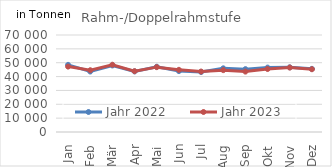
| Category | Jahr 2022 | Jahr 2023 |
|---|---|---|
| 0 | 48441.477 | 47197.034 |
| 1 | 43646.413 | 44569.553 |
| 2 | 48034.025 | 48542.596 |
| 3 | 43739.67 | 43866.405 |
| 4 | 47099.48 | 46800.728 |
| 5 | 43959.671 | 44861.005 |
| 6 | 43292.705 | 43621.286 |
| 7 | 45938.34 | 44642.545 |
| 8 | 45363.43 | 43583.346 |
| 9 | 46479.644 | 45452.514 |
| 10 | 46683.479 | 46516.121 |
| 11 | 45560.965 | 45297.068 |